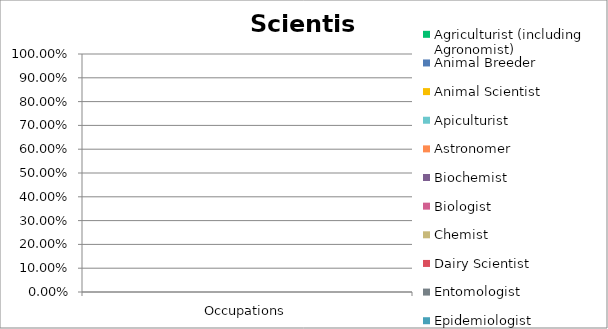
| Category | Agriculturist (including Agronomist) | Animal Breeder | Animal Scientist | Apiculturist | Astronomer | Biochemist | Biologist | Chemist | Dairy Scientist | Entomologist | Epidemiologist | Geneticist | Geologist | Geochemist | Geophysicist (including Oceanographer) | Horticulturist | Meteorologist | Pharmacologist | Physicist (including Oceanographer) | Plant Breeder | Poultry Scientist | Soil Scientist | Zoologist |
|---|---|---|---|---|---|---|---|---|---|---|---|---|---|---|---|---|---|---|---|---|---|---|---|
| Occupations | 0 | 0 | 0 | 0 | 0 | 0 | 0 | 0 | 0 | 0 | 0 | 0 | 0 | 0 | 0 | 0 | 0 | 0 | 0 | 0 | 0 | 0 | 0 |